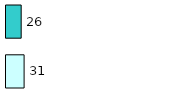
| Category | Series 0 | Series 1 |
|---|---|---|
| 0 | 31 | 26 |